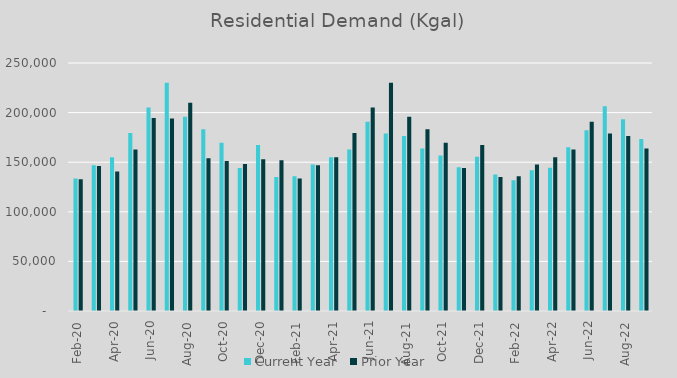
| Category | Current Year | Prior Year |
|---|---|---|
| 2020-02-01 | 133616 | 132905 |
| 2020-03-01 | 146882 | 146212 |
| 2020-04-01 | 154955 | 140621 |
| 2020-05-01 | 179419 | 162790 |
| 2020-06-01 | 205078 | 194665 |
| 2020-07-01 | 229973 | 194086 |
| 2020-08-01 | 195761 | 209888 |
| 2020-09-01 | 183286 | 154070 |
| 2020-10-01 | 169712 | 151246 |
| 2020-11-01 | 144154 | 148146 |
| 2020-12-01 | 167244 | 152941 |
| 2021-01-01 | 135131 | 152023 |
| 2021-02-01 | 135791 | 133616 |
| 2021-03-01 | 147789 | 146882 |
| 2021-04-01 | 154879 | 154955 |
| 2021-05-01 | 162769 | 179419 |
| 2021-06-01 | 190687 | 205078 |
| 2021-07-01 | 178886 | 229973 |
| 2021-08-01 | 176317 | 195761 |
| 2021-09-01 | 163837 | 183286 |
| 2021-10-01 | 156648 | 169712 |
| 2021-11-01 | 144871 | 144154 |
| 2021-12-01 | 155618 | 167244 |
| 2022-01-01 | 137724 | 135131 |
| 2022-02-01 | 131769 | 135791 |
| 2022-03-01 | 141832 | 147789 |
| 2022-04-01 | 144486 | 154879 |
| 2022-05-01 | 165127 | 162769 |
| 2022-06-01 | 182180 | 190687 |
| 2022-07-01 | 206465 | 178886 |
| 2022-08-01 | 193258 | 176317 |
| 2022-09-01 | 173336 | 163837 |